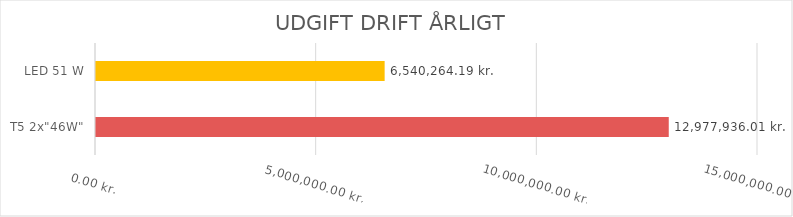
| Category | ENERGIUDGIFT ÅRLIGT KR./KWH  |
|---|---|
| T5 2x"46W" | 12977936.009 |
| LED 51 W | 6540264.194 |